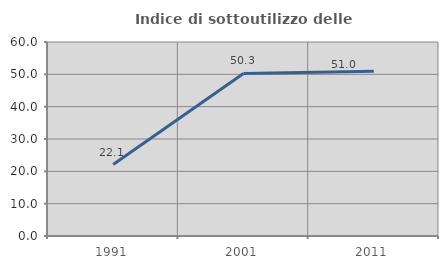
| Category | Indice di sottoutilizzo delle abitazioni  |
|---|---|
| 1991.0 | 22.111 |
| 2001.0 | 50.282 |
| 2011.0 | 50.955 |